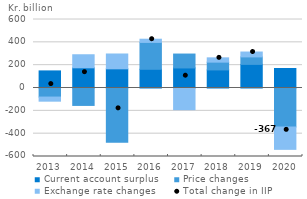
| Category | Current account surplus | Price changes | Exchange rate changes |
|---|---|---|---|
| 2013.0 | 149.723 | -79.361 | -36.029 |
| 2014.0 | 176.807 | -152.61 | 114.413 |
| 2015.0 | 167.896 | -475.891 | 129.991 |
| 2016.0 | 163.853 | 235.473 | 28.054 |
| 2017.0 | 175.63 | 121.82 | -189.783 |
| 2018.0 | 158.178 | 68.323 | 37.613 |
| 2019.0 | 206.803 | 65.57 | 42.825 |
| 2020.0 | 170.842 | -341.6 | -195.834 |